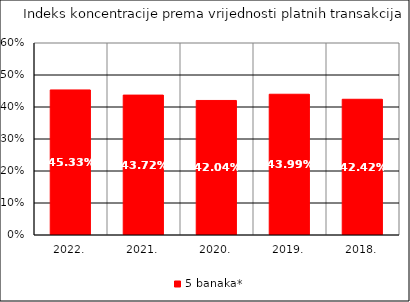
| Category | 5 banaka* |
|---|---|
| 2022. | 0.453 |
| 2021. | 0.437 |
| 2020. | 0.42 |
| 2019. | 0.44 |
| 2018. | 0.424 |